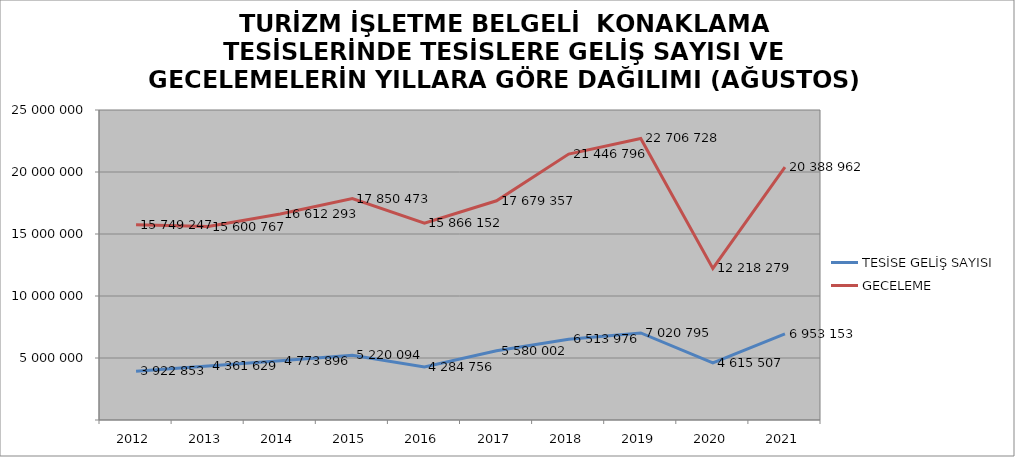
| Category | TESİSE GELİŞ SAYISI | GECELEME |
|---|---|---|
| 2012 | 3922853 | 15749247 |
| 2013 | 4361629 | 15600767 |
| 2014 | 4773896 | 16612293 |
| 2015 | 5220094 | 17850473 |
| 2016 | 4284756 | 15866152 |
| 2017 | 5580002 | 17679357 |
| 2018 | 6513976 | 21446796 |
| 2019 | 7020795 | 22706728 |
| 2020 | 4615507 | 12218279 |
| 2021 | 6953153 | 20388962 |